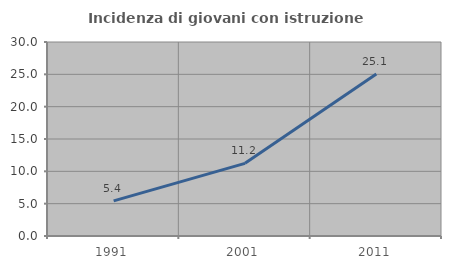
| Category | Incidenza di giovani con istruzione universitaria |
|---|---|
| 1991.0 | 5.423 |
| 2001.0 | 11.236 |
| 2011.0 | 25.063 |